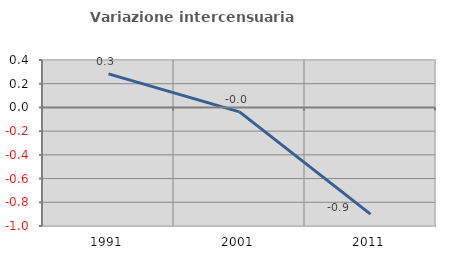
| Category | Variazione intercensuaria annua |
|---|---|
| 1991.0 | 0.283 |
| 2001.0 | -0.037 |
| 2011.0 | -0.899 |